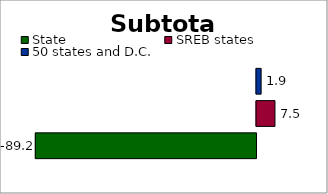
| Category | State | SREB states | 50 states and D.C. |
|---|---|---|---|
| 0 | -89.159 | 7.459 | 1.869 |